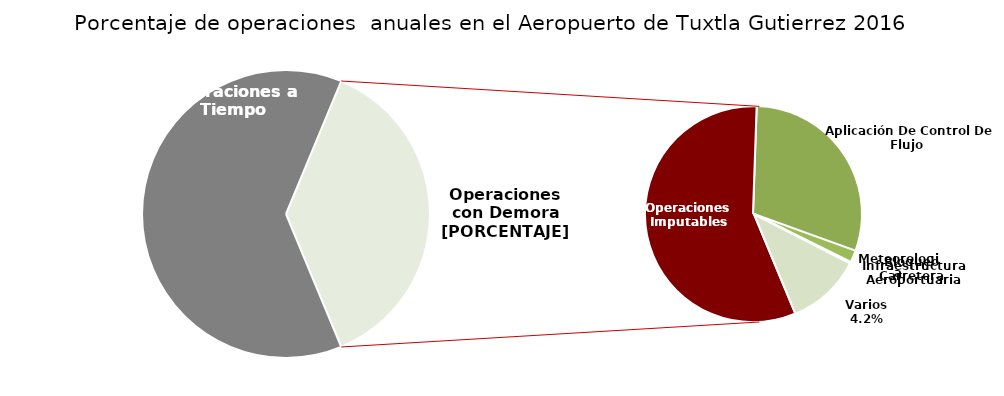
| Category | Series 0 |
|---|---|
| Operaciones a Tiempo | 7593 |
| Operaciones Imputables | 2585 |
| Aplicación De Control De Flujo  | 1364 |
| Meteorologia | 81 |
| Infraestructura Aeroportuaria | 9 |
| Bloqueo Carretera | 3 |
| Varios | 508 |